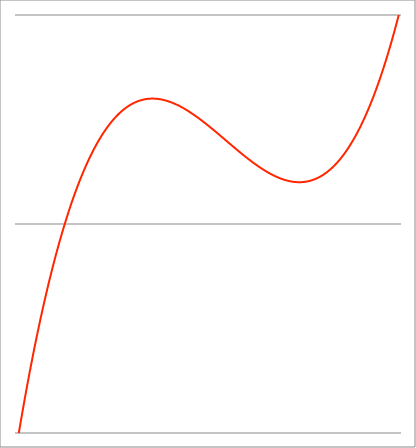
| Category | Series 1 |
|---|---|
| -3.86 | -1.081 |
| -3.85737 | -1.076 |
| -3.85474 | -1.07 |
| -3.85211 | -1.064 |
| -3.84948 | -1.059 |
| -3.84685 | -1.053 |
| -3.84422 | -1.048 |
| -3.84159 | -1.042 |
| -3.838960000000001 | -1.036 |
| -3.836330000000001 | -1.031 |
| -3.833700000000001 | -1.025 |
| -3.831070000000001 | -1.02 |
| -3.828440000000001 | -1.014 |
| -3.825810000000001 | -1.009 |
| -3.823180000000001 | -1.003 |
| -3.820550000000001 | -0.998 |
| -3.817920000000001 | -0.992 |
| -3.815290000000001 | -0.987 |
| -3.812660000000001 | -0.981 |
| -3.810030000000002 | -0.976 |
| -3.807400000000002 | -0.97 |
| -3.804770000000002 | -0.965 |
| -3.802140000000002 | -0.96 |
| -3.799510000000002 | -0.954 |
| -3.796880000000002 | -0.949 |
| -3.794250000000002 | -0.943 |
| -3.791620000000002 | -0.938 |
| -3.788990000000002 | -0.933 |
| -3.786360000000002 | -0.927 |
| -3.783730000000002 | -0.922 |
| -3.781100000000002 | -0.917 |
| -3.778470000000003 | -0.911 |
| -3.775840000000003 | -0.906 |
| -3.773210000000003 | -0.901 |
| -3.770580000000003 | -0.896 |
| -3.767950000000003 | -0.89 |
| -3.765320000000003 | -0.885 |
| -3.762690000000003 | -0.88 |
| -3.760060000000003 | -0.875 |
| -3.757430000000003 | -0.869 |
| -3.754800000000003 | -0.864 |
| -3.752170000000003 | -0.859 |
| -3.749540000000004 | -0.854 |
| -3.746910000000004 | -0.849 |
| -3.744280000000004 | -0.843 |
| -3.741650000000004 | -0.838 |
| -3.739020000000004 | -0.833 |
| -3.736390000000004 | -0.828 |
| -3.733760000000004 | -0.823 |
| -3.731130000000004 | -0.818 |
| -3.728500000000004 | -0.813 |
| -3.725870000000004 | -0.808 |
| -3.723240000000004 | -0.803 |
| -3.720610000000005 | -0.798 |
| -3.717980000000005 | -0.792 |
| -3.715350000000005 | -0.787 |
| -3.712720000000005 | -0.782 |
| -3.710090000000005 | -0.777 |
| -3.707460000000005 | -0.772 |
| -3.704830000000005 | -0.767 |
| -3.702200000000005 | -0.762 |
| -3.699570000000005 | -0.757 |
| -3.696940000000005 | -0.753 |
| -3.694310000000005 | -0.748 |
| -3.691680000000006 | -0.743 |
| -3.689050000000006 | -0.738 |
| -3.686420000000006 | -0.733 |
| -3.683790000000006 | -0.728 |
| -3.681160000000006 | -0.723 |
| -3.678530000000006 | -0.718 |
| -3.675900000000006 | -0.713 |
| -3.673270000000006 | -0.708 |
| -3.670640000000006 | -0.704 |
| -3.668010000000006 | -0.699 |
| -3.665380000000006 | -0.694 |
| -3.662750000000007 | -0.689 |
| -3.660120000000006 | -0.684 |
| -3.657490000000007 | -0.68 |
| -3.654860000000007 | -0.675 |
| -3.652230000000007 | -0.67 |
| -3.649600000000007 | -0.665 |
| -3.646970000000007 | -0.66 |
| -3.644340000000007 | -0.656 |
| -3.641710000000007 | -0.651 |
| -3.639080000000007 | -0.646 |
| -3.636450000000007 | -0.642 |
| -3.633820000000008 | -0.637 |
| -3.631190000000008 | -0.632 |
| -3.628560000000008 | -0.628 |
| -3.625930000000008 | -0.623 |
| -3.623300000000008 | -0.618 |
| -3.620670000000008 | -0.614 |
| -3.618040000000008 | -0.609 |
| -3.615410000000008 | -0.604 |
| -3.612780000000008 | -0.6 |
| -3.610150000000008 | -0.595 |
| -3.607520000000008 | -0.591 |
| -3.604890000000008 | -0.586 |
| -3.602260000000009 | -0.582 |
| -3.599630000000009 | -0.577 |
| -3.597000000000009 | -0.572 |
| -3.594370000000009 | -0.568 |
| -3.591740000000009 | -0.563 |
| -3.58911000000001 | -0.559 |
| -3.586480000000009 | -0.554 |
| -3.583850000000009 | -0.55 |
| -3.581220000000009 | -0.545 |
| -3.578590000000009 | -0.541 |
| -3.57596000000001 | -0.537 |
| -3.57333000000001 | -0.532 |
| -3.57070000000001 | -0.528 |
| -3.56807000000001 | -0.523 |
| -3.56544000000001 | -0.519 |
| -3.56281000000001 | -0.514 |
| -3.56018000000001 | -0.51 |
| -3.55755000000001 | -0.506 |
| -3.55492000000001 | -0.501 |
| -3.55229000000001 | -0.497 |
| -3.54966000000001 | -0.493 |
| -3.54703000000001 | -0.488 |
| -3.544400000000011 | -0.484 |
| -3.541770000000011 | -0.48 |
| -3.539140000000011 | -0.475 |
| -3.536510000000011 | -0.471 |
| -3.533880000000011 | -0.467 |
| -3.531250000000011 | -0.462 |
| -3.528620000000011 | -0.458 |
| -3.525990000000011 | -0.454 |
| -3.523360000000011 | -0.45 |
| -3.520730000000011 | -0.445 |
| -3.518100000000012 | -0.441 |
| -3.515470000000012 | -0.437 |
| -3.512840000000012 | -0.433 |
| -3.510210000000012 | -0.429 |
| -3.507580000000012 | -0.424 |
| -3.504950000000012 | -0.42 |
| -3.502320000000012 | -0.416 |
| -3.499690000000012 | -0.412 |
| -3.497060000000012 | -0.408 |
| -3.494430000000012 | -0.404 |
| -3.491800000000012 | -0.4 |
| -3.489170000000012 | -0.396 |
| -3.486540000000013 | -0.391 |
| -3.483910000000012 | -0.387 |
| -3.481280000000013 | -0.383 |
| -3.478650000000013 | -0.379 |
| -3.476020000000013 | -0.375 |
| -3.473390000000013 | -0.371 |
| -3.470760000000013 | -0.367 |
| -3.468130000000013 | -0.363 |
| -3.465500000000013 | -0.359 |
| -3.462870000000013 | -0.355 |
| -3.460240000000013 | -0.351 |
| -3.457610000000014 | -0.347 |
| -3.454980000000014 | -0.343 |
| -3.452350000000014 | -0.339 |
| -3.449720000000014 | -0.335 |
| -3.447090000000014 | -0.331 |
| -3.444460000000014 | -0.327 |
| -3.441830000000014 | -0.323 |
| -3.439200000000014 | -0.319 |
| -3.436570000000014 | -0.316 |
| -3.433940000000014 | -0.312 |
| -3.431310000000014 | -0.308 |
| -3.428680000000015 | -0.304 |
| -3.426050000000015 | -0.3 |
| -3.423420000000015 | -0.296 |
| -3.420790000000015 | -0.292 |
| -3.418160000000015 | -0.289 |
| -3.415530000000015 | -0.285 |
| -3.412900000000015 | -0.281 |
| -3.410270000000015 | -0.277 |
| -3.407640000000015 | -0.273 |
| -3.405010000000015 | -0.27 |
| -3.402380000000015 | -0.266 |
| -3.399750000000016 | -0.262 |
| -3.397120000000016 | -0.258 |
| -3.394490000000016 | -0.255 |
| -3.391860000000016 | -0.251 |
| -3.389230000000016 | -0.247 |
| -3.386600000000016 | -0.243 |
| -3.383970000000016 | -0.24 |
| -3.381340000000016 | -0.236 |
| -3.378710000000016 | -0.232 |
| -3.376080000000016 | -0.229 |
| -3.373450000000016 | -0.225 |
| -3.370820000000017 | -0.221 |
| -3.368190000000016 | -0.218 |
| -3.365560000000017 | -0.214 |
| -3.362930000000017 | -0.21 |
| -3.360300000000017 | -0.207 |
| -3.357670000000017 | -0.203 |
| -3.355040000000017 | -0.2 |
| -3.352410000000017 | -0.196 |
| -3.349780000000017 | -0.192 |
| -3.347150000000017 | -0.189 |
| -3.344520000000017 | -0.185 |
| -3.341890000000018 | -0.182 |
| -3.339260000000018 | -0.178 |
| -3.336630000000018 | -0.175 |
| -3.334000000000018 | -0.171 |
| -3.331370000000018 | -0.168 |
| -3.328740000000018 | -0.164 |
| -3.326110000000018 | -0.161 |
| -3.323480000000018 | -0.157 |
| -3.320850000000018 | -0.154 |
| -3.318220000000018 | -0.15 |
| -3.315590000000018 | -0.147 |
| -3.312960000000019 | -0.143 |
| -3.310330000000019 | -0.14 |
| -3.307700000000019 | -0.137 |
| -3.305070000000019 | -0.133 |
| -3.302440000000019 | -0.13 |
| -3.299810000000019 | -0.126 |
| -3.29718000000002 | -0.123 |
| -3.29455000000002 | -0.12 |
| -3.29192000000002 | -0.116 |
| -3.28929000000002 | -0.113 |
| -3.286660000000019 | -0.11 |
| -3.28403000000002 | -0.106 |
| -3.28140000000002 | -0.103 |
| -3.27877000000002 | -0.1 |
| -3.27614000000002 | -0.096 |
| -3.27351000000002 | -0.093 |
| -3.27088000000002 | -0.09 |
| -3.26825000000002 | -0.087 |
| -3.26562000000002 | -0.083 |
| -3.26299000000002 | -0.08 |
| -3.26036000000002 | -0.077 |
| -3.25773000000002 | -0.074 |
| -3.255100000000021 | -0.07 |
| -3.252470000000021 | -0.067 |
| -3.249840000000021 | -0.064 |
| -3.247210000000021 | -0.061 |
| -3.244580000000021 | -0.057 |
| -3.241950000000021 | -0.054 |
| -3.239320000000021 | -0.051 |
| -3.236690000000021 | -0.048 |
| -3.234060000000021 | -0.045 |
| -3.231430000000021 | -0.042 |
| -3.228800000000021 | -0.039 |
| -3.226170000000022 | -0.035 |
| -3.223540000000022 | -0.032 |
| -3.220910000000022 | -0.029 |
| -3.218280000000022 | -0.026 |
| -3.215650000000022 | -0.023 |
| -3.213020000000022 | -0.02 |
| -3.210390000000022 | -0.017 |
| -3.207760000000022 | -0.014 |
| -3.205130000000022 | -0.011 |
| -3.202500000000022 | -0.008 |
| -3.199870000000022 | -0.005 |
| -3.197240000000022 | -0.002 |
| -3.194610000000023 | 0.001 |
| -3.191980000000023 | 0.004 |
| -3.189350000000023 | 0.007 |
| -3.186720000000023 | 0.01 |
| -3.184090000000023 | 0.013 |
| -3.181460000000023 | 0.016 |
| -3.178830000000023 | 0.019 |
| -3.176200000000023 | 0.022 |
| -3.173570000000023 | 0.025 |
| -3.170940000000023 | 0.028 |
| -3.168310000000023 | 0.031 |
| -3.165680000000024 | 0.034 |
| -3.163050000000024 | 0.037 |
| -3.160420000000024 | 0.04 |
| -3.157790000000024 | 0.043 |
| -3.155160000000024 | 0.046 |
| -3.152530000000024 | 0.048 |
| -3.149900000000024 | 0.051 |
| -3.147270000000024 | 0.054 |
| -3.144640000000024 | 0.057 |
| -3.142010000000024 | 0.06 |
| -3.139380000000024 | 0.063 |
| -3.136750000000025 | 0.065 |
| -3.134120000000025 | 0.068 |
| -3.131490000000025 | 0.071 |
| -3.128860000000025 | 0.074 |
| -3.126230000000025 | 0.077 |
| -3.123600000000025 | 0.079 |
| -3.120970000000025 | 0.082 |
| -3.118340000000025 | 0.085 |
| -3.115710000000025 | 0.088 |
| -3.113080000000025 | 0.09 |
| -3.110450000000025 | 0.093 |
| -3.107820000000026 | 0.096 |
| -3.105190000000026 | 0.099 |
| -3.102560000000026 | 0.101 |
| -3.099930000000026 | 0.104 |
| -3.097300000000026 | 0.107 |
| -3.094670000000026 | 0.109 |
| -3.092040000000026 | 0.112 |
| -3.089410000000026 | 0.115 |
| -3.086780000000026 | 0.117 |
| -3.084150000000026 | 0.12 |
| -3.081520000000026 | 0.123 |
| -3.078890000000027 | 0.125 |
| -3.076260000000027 | 0.128 |
| -3.073630000000027 | 0.13 |
| -3.071000000000027 | 0.133 |
| -3.068370000000027 | 0.136 |
| -3.065740000000027 | 0.138 |
| -3.063110000000027 | 0.141 |
| -3.060480000000027 | 0.143 |
| -3.057850000000027 | 0.146 |
| -3.055220000000027 | 0.148 |
| -3.052590000000027 | 0.151 |
| -3.049960000000028 | 0.154 |
| -3.047330000000027 | 0.156 |
| -3.044700000000028 | 0.159 |
| -3.042070000000028 | 0.161 |
| -3.039440000000028 | 0.164 |
| -3.036810000000028 | 0.166 |
| -3.034180000000028 | 0.169 |
| -3.031550000000028 | 0.171 |
| -3.028920000000028 | 0.173 |
| -3.026290000000028 | 0.176 |
| -3.023660000000028 | 0.178 |
| -3.021030000000029 | 0.181 |
| -3.018400000000029 | 0.183 |
| -3.015770000000029 | 0.186 |
| -3.013140000000029 | 0.188 |
| -3.010510000000029 | 0.19 |
| -3.007880000000029 | 0.193 |
| -3.005250000000029 | 0.195 |
| -3.002620000000029 | 0.198 |
| -2.999990000000029 | 0.2 |
| -2.997360000000029 | 0.202 |
| -2.994730000000029 | 0.205 |
| -2.992100000000029 | 0.207 |
| -2.98947000000003 | 0.209 |
| -2.98684000000003 | 0.212 |
| -2.98421000000003 | 0.214 |
| -2.98158000000003 | 0.216 |
| -2.97895000000003 | 0.219 |
| -2.97632000000003 | 0.221 |
| -2.97369000000003 | 0.223 |
| -2.97106000000003 | 0.226 |
| -2.96843000000003 | 0.228 |
| -2.96580000000003 | 0.23 |
| -2.96317000000003 | 0.232 |
| -2.960540000000031 | 0.235 |
| -2.957910000000031 | 0.237 |
| -2.955280000000031 | 0.239 |
| -2.952650000000031 | 0.241 |
| -2.950020000000031 | 0.243 |
| -2.947390000000031 | 0.246 |
| -2.944760000000031 | 0.248 |
| -2.942130000000031 | 0.25 |
| -2.939500000000031 | 0.252 |
| -2.936870000000031 | 0.254 |
| -2.934240000000031 | 0.257 |
| -2.931610000000032 | 0.259 |
| -2.928980000000032 | 0.261 |
| -2.926350000000032 | 0.263 |
| -2.923720000000032 | 0.265 |
| -2.921090000000032 | 0.267 |
| -2.918460000000032 | 0.269 |
| -2.915830000000032 | 0.272 |
| -2.913200000000032 | 0.274 |
| -2.910570000000032 | 0.276 |
| -2.907940000000032 | 0.278 |
| -2.905310000000032 | 0.28 |
| -2.902680000000033 | 0.282 |
| -2.900050000000033 | 0.284 |
| -2.897420000000033 | 0.286 |
| -2.894790000000033 | 0.288 |
| -2.892160000000033 | 0.29 |
| -2.889530000000033 | 0.292 |
| -2.886900000000033 | 0.294 |
| -2.884270000000033 | 0.296 |
| -2.881640000000033 | 0.298 |
| -2.879010000000033 | 0.3 |
| -2.876380000000033 | 0.302 |
| -2.873750000000034 | 0.304 |
| -2.871120000000034 | 0.306 |
| -2.868490000000034 | 0.308 |
| -2.865860000000034 | 0.31 |
| -2.863230000000034 | 0.312 |
| -2.860600000000034 | 0.314 |
| -2.857970000000034 | 0.316 |
| -2.855340000000034 | 0.318 |
| -2.852710000000034 | 0.32 |
| -2.850080000000034 | 0.322 |
| -2.847450000000034 | 0.324 |
| -2.844820000000034 | 0.326 |
| -2.842190000000035 | 0.327 |
| -2.839560000000035 | 0.329 |
| -2.836930000000035 | 0.331 |
| -2.834300000000035 | 0.333 |
| -2.831670000000035 | 0.335 |
| -2.829040000000035 | 0.337 |
| -2.826410000000035 | 0.339 |
| -2.823780000000035 | 0.341 |
| -2.821150000000035 | 0.342 |
| -2.818520000000035 | 0.344 |
| -2.815890000000035 | 0.346 |
| -2.813260000000036 | 0.348 |
| -2.810630000000036 | 0.35 |
| -2.808000000000036 | 0.351 |
| -2.805370000000036 | 0.353 |
| -2.802740000000036 | 0.355 |
| -2.800110000000036 | 0.357 |
| -2.797480000000036 | 0.358 |
| -2.794850000000036 | 0.36 |
| -2.792220000000036 | 0.362 |
| -2.789590000000036 | 0.364 |
| -2.786960000000036 | 0.365 |
| -2.784330000000036 | 0.367 |
| -2.781700000000036 | 0.369 |
| -2.779070000000037 | 0.371 |
| -2.776440000000037 | 0.372 |
| -2.773810000000037 | 0.374 |
| -2.771180000000037 | 0.376 |
| -2.768550000000037 | 0.377 |
| -2.765920000000037 | 0.379 |
| -2.763290000000037 | 0.381 |
| -2.760660000000037 | 0.382 |
| -2.758030000000037 | 0.384 |
| -2.755400000000038 | 0.386 |
| -2.752770000000038 | 0.387 |
| -2.750140000000038 | 0.389 |
| -2.747510000000037 | 0.391 |
| -2.744880000000038 | 0.392 |
| -2.742250000000038 | 0.394 |
| -2.739620000000038 | 0.395 |
| -2.736990000000038 | 0.397 |
| -2.734360000000038 | 0.399 |
| -2.731730000000038 | 0.4 |
| -2.729100000000038 | 0.402 |
| -2.726470000000039 | 0.403 |
| -2.723840000000039 | 0.405 |
| -2.721210000000039 | 0.406 |
| -2.718580000000039 | 0.408 |
| -2.715950000000039 | 0.41 |
| -2.713320000000039 | 0.411 |
| -2.71069000000004 | 0.413 |
| -2.70806000000004 | 0.414 |
| -2.70543000000004 | 0.416 |
| -2.702800000000039 | 0.417 |
| -2.70017000000004 | 0.419 |
| -2.697540000000039 | 0.42 |
| -2.69491000000004 | 0.422 |
| -2.69228000000004 | 0.423 |
| -2.68965000000004 | 0.425 |
| -2.68702000000004 | 0.426 |
| -2.68439000000004 | 0.427 |
| -2.68176000000004 | 0.429 |
| -2.67913000000004 | 0.43 |
| -2.67650000000004 | 0.432 |
| -2.67387000000004 | 0.433 |
| -2.67124000000004 | 0.435 |
| -2.66861000000004 | 0.436 |
| -2.665980000000041 | 0.437 |
| -2.663350000000041 | 0.439 |
| -2.660720000000041 | 0.44 |
| -2.658090000000041 | 0.442 |
| -2.655460000000041 | 0.443 |
| -2.652830000000041 | 0.444 |
| -2.650200000000041 | 0.446 |
| -2.647570000000041 | 0.447 |
| -2.644940000000041 | 0.448 |
| -2.642310000000041 | 0.45 |
| -2.639680000000041 | 0.451 |
| -2.637050000000042 | 0.452 |
| -2.634420000000042 | 0.454 |
| -2.631790000000042 | 0.455 |
| -2.629160000000042 | 0.456 |
| -2.626530000000042 | 0.458 |
| -2.623900000000042 | 0.459 |
| -2.621270000000042 | 0.46 |
| -2.618640000000042 | 0.462 |
| -2.616010000000042 | 0.463 |
| -2.613380000000042 | 0.464 |
| -2.610750000000042 | 0.465 |
| -2.608120000000042 | 0.467 |
| -2.605490000000043 | 0.468 |
| -2.602860000000043 | 0.469 |
| -2.600230000000043 | 0.47 |
| -2.597600000000043 | 0.472 |
| -2.594970000000043 | 0.473 |
| -2.592340000000043 | 0.474 |
| -2.589710000000043 | 0.475 |
| -2.587080000000043 | 0.476 |
| -2.584450000000043 | 0.478 |
| -2.581820000000044 | 0.479 |
| -2.579190000000044 | 0.48 |
| -2.576560000000044 | 0.481 |
| -2.573930000000044 | 0.482 |
| -2.571300000000044 | 0.483 |
| -2.568670000000044 | 0.485 |
| -2.566040000000044 | 0.486 |
| -2.563410000000044 | 0.487 |
| -2.560780000000044 | 0.488 |
| -2.558150000000044 | 0.489 |
| -2.555520000000044 | 0.49 |
| -2.552890000000045 | 0.491 |
| -2.550260000000045 | 0.493 |
| -2.547630000000045 | 0.494 |
| -2.545000000000045 | 0.495 |
| -2.542370000000045 | 0.496 |
| -2.539740000000045 | 0.497 |
| -2.537110000000045 | 0.498 |
| -2.534480000000045 | 0.499 |
| -2.531850000000045 | 0.5 |
| -2.529220000000045 | 0.501 |
| -2.526590000000045 | 0.502 |
| -2.523960000000045 | 0.503 |
| -2.521330000000046 | 0.504 |
| -2.518700000000046 | 0.505 |
| -2.516070000000046 | 0.506 |
| -2.513440000000046 | 0.507 |
| -2.510810000000046 | 0.508 |
| -2.508180000000046 | 0.509 |
| -2.505550000000046 | 0.51 |
| -2.502920000000046 | 0.511 |
| -2.500290000000046 | 0.512 |
| -2.497660000000046 | 0.513 |
| -2.495030000000046 | 0.514 |
| -2.492400000000047 | 0.515 |
| -2.489770000000047 | 0.516 |
| -2.487140000000047 | 0.517 |
| -2.484510000000047 | 0.518 |
| -2.481880000000047 | 0.519 |
| -2.479250000000047 | 0.52 |
| -2.476620000000047 | 0.521 |
| -2.473990000000047 | 0.522 |
| -2.471360000000047 | 0.523 |
| -2.468730000000047 | 0.524 |
| -2.466100000000047 | 0.525 |
| -2.463470000000048 | 0.526 |
| -2.460840000000048 | 0.527 |
| -2.458210000000048 | 0.527 |
| -2.455580000000048 | 0.528 |
| -2.452950000000048 | 0.529 |
| -2.450320000000048 | 0.53 |
| -2.447690000000048 | 0.531 |
| -2.445060000000048 | 0.532 |
| -2.442430000000048 | 0.533 |
| -2.439800000000048 | 0.533 |
| -2.437170000000048 | 0.534 |
| -2.434540000000049 | 0.535 |
| -2.431910000000049 | 0.536 |
| -2.429280000000049 | 0.537 |
| -2.426650000000049 | 0.538 |
| -2.424020000000049 | 0.538 |
| -2.421390000000049 | 0.539 |
| -2.418760000000049 | 0.54 |
| -2.416130000000049 | 0.541 |
| -2.413500000000049 | 0.542 |
| -2.410870000000049 | 0.542 |
| -2.408240000000049 | 0.543 |
| -2.40561000000005 | 0.544 |
| -2.40298000000005 | 0.545 |
| -2.40035000000005 | 0.545 |
| -2.39772000000005 | 0.546 |
| -2.39509000000005 | 0.547 |
| -2.39246000000005 | 0.548 |
| -2.38983000000005 | 0.548 |
| -2.38720000000005 | 0.549 |
| -2.38457000000005 | 0.55 |
| -2.38194000000005 | 0.551 |
| -2.37931000000005 | 0.551 |
| -2.37668000000005 | 0.552 |
| -2.374050000000051 | 0.553 |
| -2.371420000000051 | 0.553 |
| -2.368790000000051 | 0.554 |
| -2.366160000000051 | 0.555 |
| -2.363530000000051 | 0.556 |
| -2.360900000000051 | 0.556 |
| -2.358270000000051 | 0.557 |
| -2.355640000000051 | 0.558 |
| -2.353010000000051 | 0.558 |
| -2.350380000000051 | 0.559 |
| -2.347750000000051 | 0.56 |
| -2.345120000000052 | 0.56 |
| -2.342490000000052 | 0.561 |
| -2.339860000000052 | 0.561 |
| -2.337230000000052 | 0.562 |
| -2.334600000000052 | 0.563 |
| -2.331970000000052 | 0.563 |
| -2.329340000000052 | 0.564 |
| -2.326710000000052 | 0.564 |
| -2.324080000000052 | 0.565 |
| -2.321450000000052 | 0.566 |
| -2.318820000000052 | 0.566 |
| -2.316190000000053 | 0.567 |
| -2.313560000000053 | 0.567 |
| -2.310930000000053 | 0.568 |
| -2.308300000000053 | 0.569 |
| -2.305670000000053 | 0.569 |
| -2.303040000000053 | 0.57 |
| -2.300410000000053 | 0.57 |
| -2.297780000000053 | 0.571 |
| -2.295150000000053 | 0.571 |
| -2.292520000000053 | 0.572 |
| -2.289890000000053 | 0.572 |
| -2.287260000000053 | 0.573 |
| -2.284630000000053 | 0.573 |
| -2.282000000000054 | 0.574 |
| -2.279370000000054 | 0.574 |
| -2.276740000000054 | 0.575 |
| -2.274110000000054 | 0.575 |
| -2.271480000000054 | 0.576 |
| -2.268850000000054 | 0.576 |
| -2.266220000000054 | 0.577 |
| -2.263590000000054 | 0.577 |
| -2.260960000000054 | 0.578 |
| -2.258330000000054 | 0.578 |
| -2.255700000000055 | 0.579 |
| -2.253070000000055 | 0.579 |
| -2.250440000000055 | 0.58 |
| -2.247810000000055 | 0.58 |
| -2.245180000000055 | 0.58 |
| -2.242550000000055 | 0.581 |
| -2.239920000000055 | 0.581 |
| -2.237290000000055 | 0.582 |
| -2.234660000000055 | 0.582 |
| -2.232030000000055 | 0.583 |
| -2.229400000000056 | 0.583 |
| -2.226770000000056 | 0.583 |
| -2.224140000000056 | 0.584 |
| -2.221510000000056 | 0.584 |
| -2.218880000000056 | 0.585 |
| -2.216250000000056 | 0.585 |
| -2.213620000000056 | 0.585 |
| -2.210990000000056 | 0.586 |
| -2.208360000000056 | 0.586 |
| -2.205730000000056 | 0.586 |
| -2.203100000000056 | 0.587 |
| -2.200470000000056 | 0.587 |
| -2.197840000000057 | 0.587 |
| -2.195210000000057 | 0.588 |
| -2.192580000000057 | 0.588 |
| -2.189950000000057 | 0.588 |
| -2.187320000000056 | 0.589 |
| -2.184690000000057 | 0.589 |
| -2.182060000000057 | 0.589 |
| -2.179430000000057 | 0.59 |
| -2.176800000000057 | 0.59 |
| -2.174170000000057 | 0.59 |
| -2.171540000000058 | 0.591 |
| -2.168910000000057 | 0.591 |
| -2.166280000000058 | 0.591 |
| -2.163650000000058 | 0.592 |
| -2.161020000000058 | 0.592 |
| -2.158390000000058 | 0.592 |
| -2.155760000000058 | 0.592 |
| -2.153130000000058 | 0.593 |
| -2.150500000000058 | 0.593 |
| -2.147870000000058 | 0.593 |
| -2.145240000000058 | 0.593 |
| -2.142610000000059 | 0.594 |
| -2.139980000000059 | 0.594 |
| -2.137350000000059 | 0.594 |
| -2.134720000000059 | 0.594 |
| -2.132090000000059 | 0.595 |
| -2.129460000000059 | 0.595 |
| -2.12683000000006 | 0.595 |
| -2.12420000000006 | 0.595 |
| -2.12157000000006 | 0.595 |
| -2.118940000000059 | 0.596 |
| -2.116310000000059 | 0.596 |
| -2.11368000000006 | 0.596 |
| -2.11105000000006 | 0.596 |
| -2.10842000000006 | 0.596 |
| -2.10579000000006 | 0.597 |
| -2.10316000000006 | 0.597 |
| -2.10053000000006 | 0.597 |
| -2.09790000000006 | 0.597 |
| -2.09527000000006 | 0.597 |
| -2.09264000000006 | 0.597 |
| -2.09001000000006 | 0.597 |
| -2.08738000000006 | 0.598 |
| -2.08475000000006 | 0.598 |
| -2.082120000000061 | 0.598 |
| -2.079490000000061 | 0.598 |
| -2.076860000000061 | 0.598 |
| -2.074230000000061 | 0.598 |
| -2.071600000000061 | 0.598 |
| -2.068970000000061 | 0.599 |
| -2.066340000000061 | 0.599 |
| -2.063710000000061 | 0.599 |
| -2.061080000000061 | 0.599 |
| -2.058450000000061 | 0.599 |
| -2.055820000000061 | 0.599 |
| -2.053190000000062 | 0.599 |
| -2.050560000000062 | 0.599 |
| -2.047930000000062 | 0.599 |
| -2.045300000000062 | 0.599 |
| -2.042670000000062 | 0.599 |
| -2.040040000000062 | 0.6 |
| -2.037410000000062 | 0.6 |
| -2.034780000000062 | 0.6 |
| -2.032150000000062 | 0.6 |
| -2.029520000000062 | 0.6 |
| -2.026890000000062 | 0.6 |
| -2.024260000000063 | 0.6 |
| -2.021630000000063 | 0.6 |
| -2.019000000000063 | 0.6 |
| -2.016370000000063 | 0.6 |
| -2.013740000000063 | 0.6 |
| -2.011110000000063 | 0.6 |
| -2.008480000000063 | 0.6 |
| -2.005850000000063 | 0.6 |
| -2.003220000000063 | 0.6 |
| -2.000590000000063 | 0.6 |
| -1.997960000000063 | 0.6 |
| -1.995330000000064 | 0.6 |
| -1.992700000000064 | 0.6 |
| -1.990070000000064 | 0.6 |
| -1.987440000000064 | 0.6 |
| -1.984810000000064 | 0.6 |
| -1.982180000000064 | 0.6 |
| -1.979550000000064 | 0.6 |
| -1.976920000000064 | 0.6 |
| -1.974290000000064 | 0.6 |
| -1.971660000000064 | 0.6 |
| -1.969030000000064 | 0.6 |
| -1.966400000000065 | 0.6 |
| -1.963770000000065 | 0.6 |
| -1.961140000000065 | 0.6 |
| -1.958510000000065 | 0.599 |
| -1.955880000000065 | 0.599 |
| -1.953250000000065 | 0.599 |
| -1.950620000000065 | 0.599 |
| -1.947990000000065 | 0.599 |
| -1.945360000000065 | 0.599 |
| -1.942730000000065 | 0.599 |
| -1.940100000000065 | 0.599 |
| -1.937470000000065 | 0.599 |
| -1.934840000000066 | 0.599 |
| -1.932210000000066 | 0.599 |
| -1.929580000000066 | 0.599 |
| -1.926950000000066 | 0.598 |
| -1.924320000000066 | 0.598 |
| -1.921690000000066 | 0.598 |
| -1.919060000000066 | 0.598 |
| -1.916430000000066 | 0.598 |
| -1.913800000000066 | 0.598 |
| -1.911170000000066 | 0.598 |
| -1.908540000000066 | 0.598 |
| -1.905910000000067 | 0.597 |
| -1.903280000000067 | 0.597 |
| -1.900650000000067 | 0.597 |
| -1.898020000000067 | 0.597 |
| -1.895390000000067 | 0.597 |
| -1.892760000000067 | 0.597 |
| -1.890130000000067 | 0.597 |
| -1.887500000000067 | 0.596 |
| -1.884870000000067 | 0.596 |
| -1.882240000000067 | 0.596 |
| -1.879610000000067 | 0.596 |
| -1.876980000000068 | 0.596 |
| -1.874350000000068 | 0.595 |
| -1.871720000000068 | 0.595 |
| -1.869090000000068 | 0.595 |
| -1.866460000000068 | 0.595 |
| -1.863830000000068 | 0.595 |
| -1.861200000000068 | 0.594 |
| -1.858570000000068 | 0.594 |
| -1.855940000000068 | 0.594 |
| -1.853310000000068 | 0.594 |
| -1.850680000000068 | 0.594 |
| -1.848050000000069 | 0.593 |
| -1.845420000000069 | 0.593 |
| -1.842790000000069 | 0.593 |
| -1.840160000000069 | 0.593 |
| -1.837530000000069 | 0.593 |
| -1.834900000000069 | 0.592 |
| -1.83227000000007 | 0.592 |
| -1.829640000000069 | 0.592 |
| -1.827010000000069 | 0.592 |
| -1.824380000000069 | 0.591 |
| -1.821750000000069 | 0.591 |
| -1.81912000000007 | 0.591 |
| -1.81649000000007 | 0.591 |
| -1.81386000000007 | 0.59 |
| -1.81123000000007 | 0.59 |
| -1.80860000000007 | 0.59 |
| -1.80597000000007 | 0.589 |
| -1.80334000000007 | 0.589 |
| -1.80071000000007 | 0.589 |
| -1.79808000000007 | 0.589 |
| -1.79545000000007 | 0.588 |
| -1.79282000000007 | 0.588 |
| -1.79019000000007 | 0.588 |
| -1.787560000000071 | 0.587 |
| -1.784930000000071 | 0.587 |
| -1.782300000000071 | 0.587 |
| -1.779670000000071 | 0.587 |
| -1.777040000000071 | 0.586 |
| -1.774410000000071 | 0.586 |
| -1.771780000000071 | 0.586 |
| -1.769150000000071 | 0.585 |
| -1.766520000000071 | 0.585 |
| -1.763890000000071 | 0.585 |
| -1.761260000000071 | 0.584 |
| -1.758630000000072 | 0.584 |
| -1.756000000000072 | 0.584 |
| -1.753370000000072 | 0.583 |
| -1.750740000000072 | 0.583 |
| -1.748110000000072 | 0.583 |
| -1.745480000000072 | 0.582 |
| -1.742850000000072 | 0.582 |
| -1.740220000000072 | 0.582 |
| -1.737590000000072 | 0.581 |
| -1.734960000000072 | 0.581 |
| -1.732330000000072 | 0.58 |
| -1.729700000000073 | 0.58 |
| -1.727070000000073 | 0.58 |
| -1.724440000000073 | 0.579 |
| -1.721810000000073 | 0.579 |
| -1.719180000000073 | 0.579 |
| -1.716550000000073 | 0.578 |
| -1.713920000000073 | 0.578 |
| -1.711290000000073 | 0.577 |
| -1.708660000000073 | 0.577 |
| -1.706030000000073 | 0.577 |
| -1.703400000000073 | 0.576 |
| -1.700770000000074 | 0.576 |
| -1.698140000000074 | 0.575 |
| -1.695510000000074 | 0.575 |
| -1.692880000000074 | 0.575 |
| -1.690250000000074 | 0.574 |
| -1.687620000000074 | 0.574 |
| -1.684990000000074 | 0.573 |
| -1.682360000000074 | 0.573 |
| -1.679730000000074 | 0.573 |
| -1.677100000000074 | 0.572 |
| -1.674470000000074 | 0.572 |
| -1.671840000000075 | 0.571 |
| -1.669210000000075 | 0.571 |
| -1.666580000000075 | 0.57 |
| -1.663950000000075 | 0.57 |
| -1.661320000000075 | 0.569 |
| -1.658690000000075 | 0.569 |
| -1.656060000000075 | 0.569 |
| -1.653430000000075 | 0.568 |
| -1.650800000000075 | 0.568 |
| -1.648170000000075 | 0.567 |
| -1.645540000000075 | 0.567 |
| -1.642910000000075 | 0.566 |
| -1.640280000000076 | 0.566 |
| -1.637650000000076 | 0.565 |
| -1.635020000000076 | 0.565 |
| -1.632390000000076 | 0.564 |
| -1.629760000000076 | 0.564 |
| -1.627130000000076 | 0.563 |
| -1.624500000000076 | 0.563 |
| -1.621870000000076 | 0.563 |
| -1.619240000000076 | 0.562 |
| -1.616610000000076 | 0.562 |
| -1.613980000000076 | 0.561 |
| -1.611350000000077 | 0.561 |
| -1.608720000000077 | 0.56 |
| -1.606090000000077 | 0.56 |
| -1.603460000000077 | 0.559 |
| -1.600830000000077 | 0.559 |
| -1.598200000000077 | 0.558 |
| -1.595570000000077 | 0.558 |
| -1.592940000000077 | 0.557 |
| -1.590310000000077 | 0.557 |
| -1.587680000000077 | 0.556 |
| -1.585050000000078 | 0.555 |
| -1.582420000000078 | 0.555 |
| -1.579790000000078 | 0.554 |
| -1.577160000000078 | 0.554 |
| -1.574530000000078 | 0.553 |
| -1.571900000000078 | 0.553 |
| -1.569270000000078 | 0.552 |
| -1.566640000000078 | 0.552 |
| -1.564010000000078 | 0.551 |
| -1.561380000000078 | 0.551 |
| -1.558750000000078 | 0.55 |
| -1.556120000000079 | 0.55 |
| -1.553490000000079 | 0.549 |
| -1.550860000000079 | 0.549 |
| -1.548230000000079 | 0.548 |
| -1.545600000000079 | 0.547 |
| -1.542970000000079 | 0.547 |
| -1.54034000000008 | 0.546 |
| -1.537710000000079 | 0.546 |
| -1.535080000000079 | 0.545 |
| -1.532450000000079 | 0.545 |
| -1.529820000000079 | 0.544 |
| -1.52719000000008 | 0.544 |
| -1.52456000000008 | 0.543 |
| -1.52193000000008 | 0.542 |
| -1.51930000000008 | 0.542 |
| -1.51667000000008 | 0.541 |
| -1.51404000000008 | 0.541 |
| -1.51141000000008 | 0.54 |
| -1.50878000000008 | 0.539 |
| -1.50615000000008 | 0.539 |
| -1.50352000000008 | 0.538 |
| -1.50089000000008 | 0.538 |
| -1.49826000000008 | 0.537 |
| -1.495630000000081 | 0.537 |
| -1.493000000000081 | 0.536 |
| -1.490370000000081 | 0.535 |
| -1.487740000000081 | 0.535 |
| -1.485110000000081 | 0.534 |
| -1.482480000000081 | 0.534 |
| -1.479850000000081 | 0.533 |
| -1.477220000000081 | 0.532 |
| -1.474590000000081 | 0.532 |
| -1.471960000000081 | 0.531 |
| -1.469330000000081 | 0.53 |
| -1.466700000000082 | 0.53 |
| -1.464070000000082 | 0.529 |
| -1.461440000000082 | 0.529 |
| -1.458810000000082 | 0.528 |
| -1.456180000000082 | 0.527 |
| -1.453550000000082 | 0.527 |
| -1.450920000000082 | 0.526 |
| -1.448290000000082 | 0.525 |
| -1.445660000000082 | 0.525 |
| -1.443030000000082 | 0.524 |
| -1.440400000000082 | 0.524 |
| -1.437770000000083 | 0.523 |
| -1.435140000000083 | 0.522 |
| -1.432510000000083 | 0.522 |
| -1.429880000000083 | 0.521 |
| -1.427250000000083 | 0.52 |
| -1.424620000000083 | 0.52 |
| -1.421990000000083 | 0.519 |
| -1.419360000000083 | 0.518 |
| -1.416730000000083 | 0.518 |
| -1.414100000000083 | 0.517 |
| -1.411470000000083 | 0.516 |
| -1.408840000000084 | 0.516 |
| -1.406210000000084 | 0.515 |
| -1.403580000000084 | 0.515 |
| -1.400950000000084 | 0.514 |
| -1.398320000000084 | 0.513 |
| -1.395690000000084 | 0.513 |
| -1.393060000000084 | 0.512 |
| -1.390430000000084 | 0.511 |
| -1.387800000000084 | 0.511 |
| -1.385170000000084 | 0.51 |
| -1.382540000000084 | 0.509 |
| -1.379910000000085 | 0.508 |
| -1.377280000000085 | 0.508 |
| -1.374650000000085 | 0.507 |
| -1.372020000000085 | 0.506 |
| -1.369390000000085 | 0.506 |
| -1.366760000000085 | 0.505 |
| -1.364130000000085 | 0.504 |
| -1.361500000000085 | 0.504 |
| -1.358870000000085 | 0.503 |
| -1.356240000000085 | 0.502 |
| -1.353610000000085 | 0.502 |
| -1.350980000000086 | 0.501 |
| -1.348350000000086 | 0.5 |
| -1.345720000000086 | 0.5 |
| -1.343090000000086 | 0.499 |
| -1.340460000000086 | 0.498 |
| -1.337830000000086 | 0.497 |
| -1.335200000000086 | 0.497 |
| -1.332570000000086 | 0.496 |
| -1.329940000000086 | 0.495 |
| -1.327310000000086 | 0.495 |
| -1.324680000000086 | 0.494 |
| -1.322050000000086 | 0.493 |
| -1.319420000000087 | 0.493 |
| -1.316790000000087 | 0.492 |
| -1.314160000000087 | 0.491 |
| -1.311530000000087 | 0.49 |
| -1.308900000000087 | 0.49 |
| -1.306270000000087 | 0.489 |
| -1.303640000000087 | 0.488 |
| -1.301010000000087 | 0.488 |
| -1.298380000000087 | 0.487 |
| -1.295750000000087 | 0.486 |
| -1.293120000000087 | 0.485 |
| -1.290490000000088 | 0.485 |
| -1.287860000000088 | 0.484 |
| -1.285230000000088 | 0.483 |
| -1.282600000000088 | 0.483 |
| -1.279970000000088 | 0.482 |
| -1.277340000000088 | 0.481 |
| -1.274710000000088 | 0.48 |
| -1.272080000000088 | 0.48 |
| -1.269450000000088 | 0.479 |
| -1.266820000000088 | 0.478 |
| -1.264190000000088 | 0.477 |
| -1.261560000000089 | 0.477 |
| -1.258930000000089 | 0.476 |
| -1.256300000000089 | 0.475 |
| -1.253670000000089 | 0.474 |
| -1.251040000000089 | 0.474 |
| -1.24841000000009 | 0.473 |
| -1.245780000000089 | 0.472 |
| -1.243150000000089 | 0.472 |
| -1.240520000000089 | 0.471 |
| -1.237890000000089 | 0.47 |
| -1.235260000000089 | 0.469 |
| -1.23263000000009 | 0.469 |
| -1.23000000000009 | 0.468 |
| -1.22737000000009 | 0.467 |
| -1.22474000000009 | 0.466 |
| -1.22211000000009 | 0.466 |
| -1.21948000000009 | 0.465 |
| -1.21685000000009 | 0.464 |
| -1.21422000000009 | 0.463 |
| -1.21159000000009 | 0.463 |
| -1.20896000000009 | 0.462 |
| -1.20633000000009 | 0.461 |
| -1.203700000000091 | 0.46 |
| -1.201070000000091 | 0.46 |
| -1.198440000000091 | 0.459 |
| -1.195810000000091 | 0.458 |
| -1.193180000000091 | 0.457 |
| -1.190550000000091 | 0.456 |
| -1.187920000000091 | 0.456 |
| -1.185290000000091 | 0.455 |
| -1.182660000000091 | 0.454 |
| -1.180030000000091 | 0.453 |
| -1.177400000000091 | 0.453 |
| -1.174770000000092 | 0.452 |
| -1.172140000000092 | 0.451 |
| -1.169510000000092 | 0.45 |
| -1.166880000000092 | 0.45 |
| -1.164250000000092 | 0.449 |
| -1.161620000000092 | 0.448 |
| -1.158990000000092 | 0.447 |
| -1.156360000000092 | 0.447 |
| -1.153730000000092 | 0.446 |
| -1.151100000000092 | 0.445 |
| -1.148470000000092 | 0.444 |
| -1.145840000000093 | 0.443 |
| -1.143210000000093 | 0.443 |
| -1.140580000000093 | 0.442 |
| -1.137950000000093 | 0.441 |
| -1.135320000000093 | 0.44 |
| -1.132690000000093 | 0.44 |
| -1.130060000000093 | 0.439 |
| -1.127430000000093 | 0.438 |
| -1.124800000000093 | 0.437 |
| -1.122170000000093 | 0.436 |
| -1.119540000000093 | 0.436 |
| -1.116910000000094 | 0.435 |
| -1.114280000000094 | 0.434 |
| -1.111650000000094 | 0.433 |
| -1.109020000000094 | 0.433 |
| -1.106390000000094 | 0.432 |
| -1.103760000000094 | 0.431 |
| -1.101130000000094 | 0.43 |
| -1.098500000000094 | 0.429 |
| -1.095870000000094 | 0.429 |
| -1.093240000000094 | 0.428 |
| -1.090610000000094 | 0.427 |
| -1.087980000000095 | 0.426 |
| -1.085350000000095 | 0.426 |
| -1.082720000000095 | 0.425 |
| -1.080090000000095 | 0.424 |
| -1.077460000000095 | 0.423 |
| -1.074830000000095 | 0.422 |
| -1.072200000000095 | 0.422 |
| -1.069570000000095 | 0.421 |
| -1.066940000000095 | 0.42 |
| -1.064310000000095 | 0.419 |
| -1.061680000000095 | 0.418 |
| -1.059050000000096 | 0.418 |
| -1.056420000000096 | 0.417 |
| -1.053790000000096 | 0.416 |
| -1.051160000000096 | 0.415 |
| -1.048530000000096 | 0.415 |
| -1.045900000000096 | 0.414 |
| -1.043270000000096 | 0.413 |
| -1.040640000000096 | 0.412 |
| -1.038010000000096 | 0.411 |
| -1.035380000000096 | 0.411 |
| -1.032750000000096 | 0.41 |
| -1.030120000000097 | 0.409 |
| -1.027490000000097 | 0.408 |
| -1.024860000000097 | 0.407 |
| -1.022230000000097 | 0.407 |
| -1.019600000000097 | 0.406 |
| -1.016970000000097 | 0.405 |
| -1.014340000000097 | 0.404 |
| -1.011710000000097 | 0.404 |
| -1.009080000000097 | 0.403 |
| -1.006450000000097 | 0.402 |
| -1.003820000000097 | 0.401 |
| -1.001190000000098 | 0.4 |
| -0.998560000000097 | 0.4 |
| -0.995930000000097 | 0.399 |
| -0.993300000000097 | 0.398 |
| -0.990670000000097 | 0.397 |
| -0.988040000000097 | 0.396 |
| -0.985410000000097 | 0.396 |
| -0.982780000000097 | 0.395 |
| -0.980150000000097 | 0.394 |
| -0.977520000000097 | 0.393 |
| -0.974890000000097 | 0.392 |
| -0.972260000000097 | 0.392 |
| -0.969630000000097 | 0.391 |
| -0.967000000000097 | 0.39 |
| -0.964370000000097 | 0.389 |
| -0.961740000000097 | 0.389 |
| -0.959110000000097 | 0.388 |
| -0.956480000000097 | 0.387 |
| -0.953850000000097 | 0.386 |
| -0.951220000000097 | 0.385 |
| -0.948590000000097 | 0.385 |
| -0.945960000000097 | 0.384 |
| -0.943330000000097 | 0.383 |
| -0.940700000000097 | 0.382 |
| -0.938070000000097 | 0.381 |
| -0.935440000000097 | 0.381 |
| -0.932810000000097 | 0.38 |
| -0.930180000000097 | 0.379 |
| -0.927550000000097 | 0.378 |
| -0.924920000000097 | 0.378 |
| -0.922290000000097 | 0.377 |
| -0.919660000000097 | 0.376 |
| -0.917030000000097 | 0.375 |
| -0.914400000000097 | 0.374 |
| -0.911770000000097 | 0.374 |
| -0.909140000000097 | 0.373 |
| -0.906510000000097 | 0.372 |
| -0.903880000000097 | 0.371 |
| -0.901250000000097 | 0.37 |
| -0.898620000000097 | 0.37 |
| -0.895990000000097 | 0.369 |
| -0.893360000000097 | 0.368 |
| -0.890730000000097 | 0.367 |
| -0.888100000000097 | 0.367 |
| -0.885470000000097 | 0.366 |
| -0.882840000000096 | 0.365 |
| -0.880210000000096 | 0.364 |
| -0.877580000000096 | 0.363 |
| -0.874950000000096 | 0.363 |
| -0.872320000000096 | 0.362 |
| -0.869690000000096 | 0.361 |
| -0.867060000000096 | 0.36 |
| -0.864430000000096 | 0.36 |
| -0.861800000000096 | 0.359 |
| -0.859170000000096 | 0.358 |
| -0.856540000000096 | 0.357 |
| -0.853910000000096 | 0.356 |
| -0.851280000000096 | 0.356 |
| -0.848650000000096 | 0.355 |
| -0.846020000000096 | 0.354 |
| -0.843390000000096 | 0.353 |
| -0.840760000000096 | 0.353 |
| -0.838130000000096 | 0.352 |
| -0.835500000000096 | 0.351 |
| -0.832870000000096 | 0.35 |
| -0.830240000000096 | 0.35 |
| -0.827610000000096 | 0.349 |
| -0.824980000000096 | 0.348 |
| -0.822350000000096 | 0.347 |
| -0.819720000000096 | 0.347 |
| -0.817090000000096 | 0.346 |
| -0.814460000000096 | 0.345 |
| -0.811830000000096 | 0.344 |
| -0.809200000000096 | 0.343 |
| -0.806570000000096 | 0.343 |
| -0.803940000000096 | 0.342 |
| -0.801310000000096 | 0.341 |
| -0.798680000000096 | 0.34 |
| -0.796050000000096 | 0.34 |
| -0.793420000000096 | 0.339 |
| -0.790790000000096 | 0.338 |
| -0.788160000000096 | 0.337 |
| -0.785530000000096 | 0.337 |
| -0.782900000000096 | 0.336 |
| -0.780270000000096 | 0.335 |
| -0.777640000000096 | 0.334 |
| -0.775010000000096 | 0.334 |
| -0.772380000000096 | 0.333 |
| -0.769750000000096 | 0.332 |
| -0.767120000000096 | 0.331 |
| -0.764490000000096 | 0.331 |
| -0.761860000000095 | 0.33 |
| -0.759230000000095 | 0.329 |
| -0.756600000000095 | 0.328 |
| -0.753970000000095 | 0.328 |
| -0.751340000000095 | 0.327 |
| -0.748710000000095 | 0.326 |
| -0.746080000000095 | 0.325 |
| -0.743450000000095 | 0.325 |
| -0.740820000000095 | 0.324 |
| -0.738190000000095 | 0.323 |
| -0.735560000000095 | 0.323 |
| -0.732930000000095 | 0.322 |
| -0.730300000000095 | 0.321 |
| -0.727670000000095 | 0.32 |
| -0.725040000000095 | 0.32 |
| -0.722410000000095 | 0.319 |
| -0.719780000000095 | 0.318 |
| -0.717150000000095 | 0.317 |
| -0.714520000000095 | 0.317 |
| -0.711890000000095 | 0.316 |
| -0.709260000000095 | 0.315 |
| -0.706630000000095 | 0.315 |
| -0.704000000000095 | 0.314 |
| -0.701370000000095 | 0.313 |
| -0.698740000000095 | 0.312 |
| -0.696110000000095 | 0.312 |
| -0.693480000000095 | 0.311 |
| -0.690850000000095 | 0.31 |
| -0.688220000000095 | 0.309 |
| -0.685590000000095 | 0.309 |
| -0.682960000000095 | 0.308 |
| -0.680330000000095 | 0.307 |
| -0.677700000000095 | 0.307 |
| -0.675070000000095 | 0.306 |
| -0.672440000000095 | 0.305 |
| -0.669810000000095 | 0.305 |
| -0.667180000000095 | 0.304 |
| -0.664550000000095 | 0.303 |
| -0.661920000000095 | 0.302 |
| -0.659290000000095 | 0.302 |
| -0.656660000000095 | 0.301 |
| -0.654030000000095 | 0.3 |
| -0.651400000000095 | 0.3 |
| -0.648770000000095 | 0.299 |
| -0.646140000000095 | 0.298 |
| -0.643510000000095 | 0.298 |
| -0.640880000000094 | 0.297 |
| -0.638250000000094 | 0.296 |
| -0.635620000000094 | 0.296 |
| -0.632990000000094 | 0.295 |
| -0.630360000000094 | 0.294 |
| -0.627730000000094 | 0.293 |
| -0.625100000000094 | 0.293 |
| -0.622470000000094 | 0.292 |
| -0.619840000000094 | 0.291 |
| -0.617210000000094 | 0.291 |
| -0.614580000000094 | 0.29 |
| -0.611950000000094 | 0.289 |
| -0.609320000000094 | 0.289 |
| -0.606690000000094 | 0.288 |
| -0.604060000000094 | 0.287 |
| -0.601430000000094 | 0.287 |
| -0.598800000000094 | 0.286 |
| -0.596170000000094 | 0.285 |
| -0.593540000000094 | 0.285 |
| -0.590910000000094 | 0.284 |
| -0.588280000000094 | 0.283 |
| -0.585650000000094 | 0.283 |
| -0.583020000000094 | 0.282 |
| -0.580390000000094 | 0.282 |
| -0.577760000000094 | 0.281 |
| -0.575130000000094 | 0.28 |
| -0.572500000000094 | 0.28 |
| -0.569870000000094 | 0.279 |
| -0.567240000000094 | 0.278 |
| -0.564610000000094 | 0.278 |
| -0.561980000000094 | 0.277 |
| -0.559350000000094 | 0.276 |
| -0.556720000000094 | 0.276 |
| -0.554090000000094 | 0.275 |
| -0.551460000000094 | 0.274 |
| -0.548830000000094 | 0.274 |
| -0.546200000000094 | 0.273 |
| -0.543570000000094 | 0.273 |
| -0.540940000000094 | 0.272 |
| -0.538310000000094 | 0.271 |
| -0.535680000000094 | 0.271 |
| -0.533050000000094 | 0.27 |
| -0.530420000000094 | 0.269 |
| -0.527790000000094 | 0.269 |
| -0.525160000000094 | 0.268 |
| -0.522530000000094 | 0.268 |
| -0.519900000000094 | 0.267 |
| -0.517270000000094 | 0.266 |
| -0.514640000000094 | 0.266 |
| -0.512010000000094 | 0.265 |
| -0.509380000000094 | 0.265 |
| -0.506750000000094 | 0.264 |
| -0.504120000000093 | 0.263 |
| -0.501490000000093 | 0.263 |
| -0.498860000000093 | 0.262 |
| -0.496230000000093 | 0.262 |
| -0.493600000000093 | 0.261 |
| -0.490970000000093 | 0.26 |
| -0.488340000000093 | 0.26 |
| -0.485710000000093 | 0.259 |
| -0.483080000000093 | 0.259 |
| -0.480450000000093 | 0.258 |
| -0.477820000000093 | 0.258 |
| -0.475190000000093 | 0.257 |
| -0.472560000000093 | 0.256 |
| -0.469930000000093 | 0.256 |
| -0.467300000000093 | 0.255 |
| -0.464670000000093 | 0.255 |
| -0.462040000000093 | 0.254 |
| -0.459410000000093 | 0.254 |
| -0.456780000000093 | 0.253 |
| -0.454150000000093 | 0.253 |
| -0.451520000000093 | 0.252 |
| -0.448890000000093 | 0.251 |
| -0.446260000000093 | 0.251 |
| -0.443630000000093 | 0.25 |
| -0.441000000000093 | 0.25 |
| -0.438370000000093 | 0.249 |
| -0.435740000000093 | 0.249 |
| -0.433110000000093 | 0.248 |
| -0.430480000000093 | 0.248 |
| -0.427850000000093 | 0.247 |
| -0.425220000000093 | 0.247 |
| -0.422590000000093 | 0.246 |
| -0.419960000000093 | 0.246 |
| -0.417330000000093 | 0.245 |
| -0.414700000000093 | 0.244 |
| -0.412070000000093 | 0.244 |
| -0.409440000000093 | 0.243 |
| -0.406810000000093 | 0.243 |
| -0.404180000000093 | 0.242 |
| -0.401550000000093 | 0.242 |
| -0.398920000000093 | 0.241 |
| -0.396290000000093 | 0.241 |
| -0.393660000000093 | 0.24 |
| -0.391030000000093 | 0.24 |
| -0.388400000000092 | 0.239 |
| -0.385770000000092 | 0.239 |
| -0.383140000000092 | 0.238 |
| -0.380510000000092 | 0.238 |
| -0.377880000000092 | 0.237 |
| -0.375250000000092 | 0.237 |
| -0.372620000000092 | 0.236 |
| -0.369990000000092 | 0.236 |
| -0.367360000000092 | 0.236 |
| -0.364730000000092 | 0.235 |
| -0.362100000000092 | 0.235 |
| -0.359470000000092 | 0.234 |
| -0.356840000000092 | 0.234 |
| -0.354210000000092 | 0.233 |
| -0.351580000000092 | 0.233 |
| -0.348950000000092 | 0.232 |
| -0.346320000000092 | 0.232 |
| -0.343690000000092 | 0.231 |
| -0.341060000000092 | 0.231 |
| -0.338430000000092 | 0.23 |
| -0.335800000000092 | 0.23 |
| -0.333170000000092 | 0.23 |
| -0.330540000000092 | 0.229 |
| -0.327910000000092 | 0.229 |
| -0.325280000000092 | 0.228 |
| -0.322650000000092 | 0.228 |
| -0.320020000000092 | 0.227 |
| -0.317390000000092 | 0.227 |
| -0.314760000000092 | 0.227 |
| -0.312130000000092 | 0.226 |
| -0.309500000000092 | 0.226 |
| -0.306870000000092 | 0.225 |
| -0.304240000000092 | 0.225 |
| -0.301610000000092 | 0.225 |
| -0.298980000000092 | 0.224 |
| -0.296350000000092 | 0.224 |
| -0.293720000000092 | 0.223 |
| -0.291090000000092 | 0.223 |
| -0.288460000000092 | 0.223 |
| -0.285830000000092 | 0.222 |
| -0.283200000000092 | 0.222 |
| -0.280570000000092 | 0.221 |
| -0.277940000000092 | 0.221 |
| -0.275310000000092 | 0.221 |
| -0.272680000000092 | 0.22 |
| -0.270050000000092 | 0.22 |
| -0.267420000000092 | 0.22 |
| -0.264790000000092 | 0.219 |
| -0.262160000000092 | 0.219 |
| -0.259530000000091 | 0.218 |
| -0.256900000000091 | 0.218 |
| -0.254270000000091 | 0.218 |
| -0.251640000000091 | 0.217 |
| -0.249010000000091 | 0.217 |
| -0.246380000000091 | 0.217 |
| -0.243750000000091 | 0.216 |
| -0.241120000000091 | 0.216 |
| -0.238490000000091 | 0.216 |
| -0.235860000000091 | 0.215 |
| -0.233230000000091 | 0.215 |
| -0.230600000000091 | 0.215 |
| -0.227970000000091 | 0.214 |
| -0.225340000000092 | 0.214 |
| -0.222710000000092 | 0.214 |
| -0.220080000000092 | 0.213 |
| -0.217450000000092 | 0.213 |
| -0.214820000000092 | 0.213 |
| -0.212190000000092 | 0.213 |
| -0.209560000000092 | 0.212 |
| -0.206930000000092 | 0.212 |
| -0.204300000000092 | 0.212 |
| -0.201670000000092 | 0.211 |
| -0.199040000000092 | 0.211 |
| -0.196410000000092 | 0.211 |
| -0.193780000000092 | 0.211 |
| -0.191150000000092 | 0.21 |
| -0.188520000000092 | 0.21 |
| -0.185890000000092 | 0.21 |
| -0.183260000000092 | 0.209 |
| -0.180630000000092 | 0.209 |
| -0.178000000000092 | 0.209 |
| -0.175370000000092 | 0.209 |
| -0.172740000000092 | 0.208 |
| -0.170110000000092 | 0.208 |
| -0.167480000000092 | 0.208 |
| -0.164850000000092 | 0.208 |
| -0.162220000000092 | 0.207 |
| -0.159590000000092 | 0.207 |
| -0.156960000000092 | 0.207 |
| -0.154330000000092 | 0.207 |
| -0.151700000000092 | 0.207 |
| -0.149070000000092 | 0.206 |
| -0.146440000000092 | 0.206 |
| -0.143810000000092 | 0.206 |
| -0.141180000000092 | 0.206 |
| -0.138550000000092 | 0.205 |
| -0.135920000000092 | 0.205 |
| -0.133290000000092 | 0.205 |
| -0.130660000000092 | 0.205 |
| -0.128030000000092 | 0.205 |
| -0.125400000000092 | 0.205 |
| -0.122770000000092 | 0.204 |
| -0.120140000000092 | 0.204 |
| -0.117510000000092 | 0.204 |
| -0.114880000000092 | 0.204 |
| -0.112250000000092 | 0.204 |
| -0.109620000000092 | 0.203 |
| -0.106990000000092 | 0.203 |
| -0.104360000000092 | 0.203 |
| -0.101730000000092 | 0.203 |
| -0.0991000000000918 | 0.203 |
| -0.0964700000000918 | 0.203 |
| -0.0938400000000918 | 0.203 |
| -0.0912100000000918 | 0.202 |
| -0.0885800000000918 | 0.202 |
| -0.0859500000000919 | 0.202 |
| -0.0833200000000919 | 0.202 |
| -0.0806900000000919 | 0.202 |
| -0.0780600000000919 | 0.202 |
| -0.0754300000000919 | 0.202 |
| -0.0728000000000919 | 0.202 |
| -0.0701700000000919 | 0.201 |
| -0.0675400000000919 | 0.201 |
| -0.0649100000000919 | 0.201 |
| -0.0622800000000919 | 0.201 |
| -0.0596500000000919 | 0.201 |
| -0.0570200000000919 | 0.201 |
| -0.0543900000000919 | 0.201 |
| -0.0517600000000919 | 0.201 |
| -0.0491300000000919 | 0.201 |
| -0.0465000000000919 | 0.201 |
| -0.0438700000000919 | 0.201 |
| -0.0412400000000919 | 0.201 |
| -0.0386100000000919 | 0.2 |
| -0.0359800000000919 | 0.2 |
| -0.0333500000000919 | 0.2 |
| -0.0307200000000919 | 0.2 |
| -0.0280900000000919 | 0.2 |
| -0.0254600000000919 | 0.2 |
| -0.0228300000000919 | 0.2 |
| -0.0202000000000919 | 0.2 |
| -0.0175700000000919 | 0.2 |
| -0.0149400000000919 | 0.2 |
| -0.0123100000000919 | 0.2 |
| -0.00968000000009191 | 0.2 |
| -0.00705000000009191 | 0.2 |
| -0.00442000000009191 | 0.2 |
| -0.00179000000009191 | 0.2 |
| 0.000839999999908087 | 0.2 |
| 0.00346999999990809 | 0.2 |
| 0.00609999999990809 | 0.2 |
| 0.00872999999990809 | 0.2 |
| 0.0113599999999081 | 0.2 |
| 0.0139899999999081 | 0.2 |
| 0.0166199999999081 | 0.2 |
| 0.0192499999999081 | 0.2 |
| 0.0218799999999081 | 0.2 |
| 0.0245099999999081 | 0.2 |
| 0.0271399999999081 | 0.2 |
| 0.0297699999999081 | 0.2 |
| 0.0323999999999081 | 0.2 |
| 0.0350299999999081 | 0.2 |
| 0.0376599999999081 | 0.2 |
| 0.0402899999999081 | 0.2 |
| 0.0429199999999081 | 0.201 |
| 0.0455499999999081 | 0.201 |
| 0.0481799999999081 | 0.201 |
| 0.0508099999999081 | 0.201 |
| 0.0534399999999081 | 0.201 |
| 0.0560699999999081 | 0.201 |
| 0.0586999999999081 | 0.201 |
| 0.0613299999999081 | 0.201 |
| 0.0639599999999081 | 0.201 |
| 0.0665899999999081 | 0.201 |
| 0.0692199999999081 | 0.201 |
| 0.0718499999999081 | 0.202 |
| 0.0744799999999081 | 0.202 |
| 0.077109999999908 | 0.202 |
| 0.079739999999908 | 0.202 |
| 0.082369999999908 | 0.202 |
| 0.084999999999908 | 0.202 |
| 0.087629999999908 | 0.202 |
| 0.090259999999908 | 0.203 |
| 0.092889999999908 | 0.203 |
| 0.095519999999908 | 0.203 |
| 0.098149999999908 | 0.203 |
| 0.100779999999908 | 0.203 |
| 0.103409999999908 | 0.203 |
| 0.106039999999908 | 0.203 |
| 0.108669999999908 | 0.204 |
| 0.111299999999908 | 0.204 |
| 0.113929999999908 | 0.204 |
| 0.116559999999908 | 0.204 |
| 0.119189999999908 | 0.204 |
| 0.121819999999908 | 0.205 |
| 0.124449999999908 | 0.205 |
| 0.127079999999908 | 0.205 |
| 0.129709999999908 | 0.205 |
| 0.132339999999908 | 0.205 |
| 0.134969999999908 | 0.206 |
| 0.137599999999908 | 0.206 |
| 0.140229999999908 | 0.206 |
| 0.142859999999908 | 0.206 |
| 0.145489999999908 | 0.207 |
| 0.148119999999908 | 0.207 |
| 0.150749999999908 | 0.207 |
| 0.153379999999908 | 0.207 |
| 0.156009999999908 | 0.208 |
| 0.158639999999908 | 0.208 |
| 0.161269999999908 | 0.208 |
| 0.163899999999908 | 0.208 |
| 0.166529999999908 | 0.209 |
| 0.169159999999908 | 0.209 |
| 0.171789999999908 | 0.209 |
| 0.174419999999908 | 0.21 |
| 0.177049999999908 | 0.21 |
| 0.179679999999908 | 0.21 |
| 0.182309999999908 | 0.211 |
| 0.184939999999908 | 0.211 |
| 0.187569999999908 | 0.211 |
| 0.190199999999908 | 0.212 |
| 0.192829999999908 | 0.212 |
| 0.195459999999908 | 0.212 |
| 0.198089999999908 | 0.213 |
| 0.200719999999908 | 0.213 |
| 0.203349999999908 | 0.213 |
| 0.205979999999908 | 0.214 |
| 0.208609999999908 | 0.214 |
| 0.211239999999908 | 0.214 |
| 0.213869999999908 | 0.215 |
| 0.216499999999908 | 0.215 |
| 0.219129999999908 | 0.215 |
| 0.221759999999908 | 0.216 |
| 0.224389999999908 | 0.216 |
| 0.227019999999908 | 0.217 |
| 0.229649999999908 | 0.217 |
| 0.232279999999908 | 0.217 |
| 0.234909999999908 | 0.218 |
| 0.237539999999908 | 0.218 |
| 0.240169999999908 | 0.219 |
| 0.242799999999908 | 0.219 |
| 0.245429999999908 | 0.22 |
| 0.248059999999908 | 0.22 |
| 0.250689999999908 | 0.22 |
| 0.253319999999908 | 0.221 |
| 0.255949999999908 | 0.221 |
| 0.258579999999908 | 0.222 |
| 0.261209999999908 | 0.222 |
| 0.263839999999908 | 0.223 |
| 0.266469999999908 | 0.223 |
| 0.269099999999908 | 0.224 |
| 0.271729999999908 | 0.224 |
| 0.274359999999908 | 0.225 |
| 0.276989999999908 | 0.225 |
| 0.279619999999908 | 0.226 |
| 0.282249999999908 | 0.226 |
| 0.284879999999908 | 0.227 |
| 0.287509999999908 | 0.227 |
| 0.290139999999908 | 0.228 |
| 0.292769999999908 | 0.228 |
| 0.295399999999908 | 0.229 |
| 0.298029999999908 | 0.229 |
| 0.300659999999908 | 0.23 |
| 0.303289999999908 | 0.23 |
| 0.305919999999908 | 0.231 |
| 0.308549999999908 | 0.231 |
| 0.311179999999908 | 0.232 |
| 0.313809999999908 | 0.233 |
| 0.316439999999908 | 0.233 |
| 0.319069999999908 | 0.234 |
| 0.321699999999908 | 0.234 |
| 0.324329999999908 | 0.235 |
| 0.326959999999908 | 0.236 |
| 0.329589999999908 | 0.236 |
| 0.332219999999908 | 0.237 |
| 0.334849999999908 | 0.237 |
| 0.337479999999908 | 0.238 |
| 0.340109999999908 | 0.239 |
| 0.342739999999908 | 0.239 |
| 0.345369999999908 | 0.24 |
| 0.347999999999908 | 0.241 |
| 0.350629999999908 | 0.241 |
| 0.353259999999908 | 0.242 |
| 0.355889999999908 | 0.243 |
| 0.358519999999908 | 0.243 |
| 0.361149999999908 | 0.244 |
| 0.363779999999909 | 0.245 |
| 0.366409999999909 | 0.245 |
| 0.369039999999909 | 0.246 |
| 0.371669999999909 | 0.247 |
| 0.374299999999909 | 0.247 |
| 0.376929999999909 | 0.248 |
| 0.379559999999909 | 0.249 |
| 0.382189999999909 | 0.249 |
| 0.384819999999909 | 0.25 |
| 0.387449999999909 | 0.251 |
| 0.390079999999909 | 0.252 |
| 0.392709999999909 | 0.252 |
| 0.395339999999909 | 0.253 |
| 0.397969999999909 | 0.254 |
| 0.400599999999909 | 0.255 |
| 0.403229999999909 | 0.255 |
| 0.405859999999909 | 0.256 |
| 0.408489999999909 | 0.257 |
| 0.411119999999909 | 0.258 |
| 0.413749999999909 | 0.258 |
| 0.416379999999909 | 0.259 |
| 0.419009999999909 | 0.26 |
| 0.421639999999909 | 0.261 |
| 0.424269999999909 | 0.262 |
| 0.426899999999909 | 0.262 |
| 0.429529999999909 | 0.263 |
| 0.432159999999909 | 0.264 |
| 0.434789999999909 | 0.265 |
| 0.437419999999909 | 0.266 |
| 0.440049999999909 | 0.267 |
| 0.442679999999909 | 0.267 |
| 0.445309999999909 | 0.268 |
| 0.447939999999909 | 0.269 |
| 0.450569999999909 | 0.27 |
| 0.453199999999909 | 0.271 |
| 0.455829999999909 | 0.272 |
| 0.458459999999909 | 0.273 |
| 0.461089999999909 | 0.274 |
| 0.463719999999909 | 0.274 |
| 0.466349999999909 | 0.275 |
| 0.468979999999909 | 0.276 |
| 0.471609999999909 | 0.277 |
| 0.474239999999909 | 0.278 |
| 0.476869999999909 | 0.279 |
| 0.479499999999909 | 0.28 |
| 0.482129999999909 | 0.281 |
| 0.48475999999991 | 0.282 |
| 0.48738999999991 | 0.283 |
| 0.49001999999991 | 0.284 |
| 0.49264999999991 | 0.285 |
| 0.49527999999991 | 0.286 |
| 0.49790999999991 | 0.287 |
| 0.50053999999991 | 0.288 |
| 0.50316999999991 | 0.289 |
| 0.50579999999991 | 0.29 |
| 0.50842999999991 | 0.291 |
| 0.51105999999991 | 0.292 |
| 0.51368999999991 | 0.293 |
| 0.51631999999991 | 0.294 |
| 0.51894999999991 | 0.295 |
| 0.52157999999991 | 0.296 |
| 0.52420999999991 | 0.297 |
| 0.52683999999991 | 0.298 |
| 0.52946999999991 | 0.299 |
| 0.53209999999991 | 0.3 |
| 0.53472999999991 | 0.301 |
| 0.53735999999991 | 0.302 |
| 0.53998999999991 | 0.303 |
| 0.54261999999991 | 0.304 |
| 0.54524999999991 | 0.305 |
| 0.54787999999991 | 0.306 |
| 0.55050999999991 | 0.308 |
| 0.55313999999991 | 0.309 |
| 0.55576999999991 | 0.31 |
| 0.55839999999991 | 0.311 |
| 0.56102999999991 | 0.312 |
| 0.56365999999991 | 0.313 |
| 0.56628999999991 | 0.314 |
| 0.56891999999991 | 0.316 |
| 0.57154999999991 | 0.317 |
| 0.57417999999991 | 0.318 |
| 0.57680999999991 | 0.319 |
| 0.57943999999991 | 0.32 |
| 0.58206999999991 | 0.321 |
| 0.58469999999991 | 0.323 |
| 0.58732999999991 | 0.324 |
| 0.58995999999991 | 0.325 |
| 0.59258999999991 | 0.326 |
| 0.59521999999991 | 0.327 |
| 0.59784999999991 | 0.329 |
| 0.60047999999991 | 0.33 |
| 0.60310999999991 | 0.331 |
| 0.60573999999991 | 0.332 |
| 0.60836999999991 | 0.334 |
| 0.61099999999991 | 0.335 |
| 0.61362999999991 | 0.336 |
| 0.61625999999991 | 0.337 |
| 0.61888999999991 | 0.339 |
| 0.62151999999991 | 0.34 |
| 0.624149999999911 | 0.341 |
| 0.626779999999911 | 0.342 |
| 0.629409999999911 | 0.344 |
| 0.632039999999911 | 0.345 |
| 0.634669999999911 | 0.346 |
| 0.637299999999911 | 0.348 |
| 0.639929999999911 | 0.349 |
| 0.642559999999911 | 0.35 |
| 0.645189999999911 | 0.352 |
| 0.647819999999911 | 0.353 |
| 0.650449999999911 | 0.354 |
| 0.653079999999911 | 0.356 |
| 0.655709999999911 | 0.357 |
| 0.658339999999911 | 0.359 |
| 0.660969999999911 | 0.36 |
| 0.663599999999911 | 0.361 |
| 0.666229999999911 | 0.363 |
| 0.668859999999911 | 0.364 |
| 0.671489999999911 | 0.366 |
| 0.674119999999911 | 0.367 |
| 0.676749999999911 | 0.368 |
| 0.679379999999911 | 0.37 |
| 0.682009999999911 | 0.371 |
| 0.684639999999911 | 0.373 |
| 0.687269999999911 | 0.374 |
| 0.689899999999911 | 0.376 |
| 0.692529999999911 | 0.377 |
| 0.695159999999911 | 0.379 |
| 0.697789999999911 | 0.38 |
| 0.700419999999911 | 0.382 |
| 0.703049999999911 | 0.383 |
| 0.705679999999911 | 0.385 |
| 0.708309999999911 | 0.386 |
| 0.710939999999911 | 0.388 |
| 0.713569999999911 | 0.389 |
| 0.716199999999911 | 0.391 |
| 0.718829999999911 | 0.392 |
| 0.721459999999911 | 0.394 |
| 0.724089999999911 | 0.395 |
| 0.726719999999911 | 0.397 |
| 0.729349999999911 | 0.398 |
| 0.731979999999911 | 0.4 |
| 0.734609999999911 | 0.402 |
| 0.737239999999911 | 0.403 |
| 0.739869999999911 | 0.405 |
| 0.742499999999911 | 0.406 |
| 0.745129999999912 | 0.408 |
| 0.747759999999912 | 0.41 |
| 0.750389999999912 | 0.411 |
| 0.753019999999912 | 0.413 |
| 0.755649999999912 | 0.414 |
| 0.758279999999912 | 0.416 |
| 0.760909999999912 | 0.418 |
| 0.763539999999912 | 0.419 |
| 0.766169999999912 | 0.421 |
| 0.768799999999912 | 0.423 |
| 0.771429999999912 | 0.424 |
| 0.774059999999912 | 0.426 |
| 0.776689999999912 | 0.428 |
| 0.779319999999912 | 0.43 |
| 0.781949999999912 | 0.431 |
| 0.784579999999912 | 0.433 |
| 0.787209999999912 | 0.435 |
| 0.789839999999912 | 0.436 |
| 0.792469999999912 | 0.438 |
| 0.795099999999912 | 0.44 |
| 0.797729999999912 | 0.442 |
| 0.800359999999912 | 0.443 |
| 0.802989999999912 | 0.445 |
| 0.805619999999912 | 0.447 |
| 0.808249999999912 | 0.449 |
| 0.810879999999912 | 0.451 |
| 0.813509999999912 | 0.452 |
| 0.816139999999912 | 0.454 |
| 0.818769999999912 | 0.456 |
| 0.821399999999912 | 0.458 |
| 0.824029999999912 | 0.46 |
| 0.826659999999912 | 0.462 |
| 0.829289999999912 | 0.463 |
| 0.831919999999912 | 0.465 |
| 0.834549999999912 | 0.467 |
| 0.837179999999912 | 0.469 |
| 0.839809999999912 | 0.471 |
| 0.842439999999912 | 0.473 |
| 0.845069999999912 | 0.475 |
| 0.847699999999912 | 0.476 |
| 0.850329999999912 | 0.478 |
| 0.852959999999912 | 0.48 |
| 0.855589999999912 | 0.482 |
| 0.858219999999912 | 0.484 |
| 0.860849999999912 | 0.486 |
| 0.863479999999912 | 0.488 |
| 0.866109999999913 | 0.49 |
| 0.868739999999913 | 0.492 |
| 0.871369999999913 | 0.494 |
| 0.873999999999913 | 0.496 |
| 0.876629999999913 | 0.498 |
| 0.879259999999913 | 0.5 |
| 0.881889999999913 | 0.502 |
| 0.884519999999913 | 0.504 |
| 0.887149999999913 | 0.506 |
| 0.889779999999913 | 0.508 |
| 0.892409999999913 | 0.51 |
| 0.895039999999913 | 0.512 |
| 0.897669999999913 | 0.514 |
| 0.900299999999913 | 0.516 |
| 0.902929999999913 | 0.518 |
| 0.905559999999913 | 0.52 |
| 0.908189999999913 | 0.522 |
| 0.910819999999913 | 0.524 |
| 0.913449999999913 | 0.527 |
| 0.916079999999913 | 0.529 |
| 0.918709999999913 | 0.531 |
| 0.921339999999913 | 0.533 |
| 0.923969999999913 | 0.535 |
| 0.926599999999913 | 0.537 |
| 0.929229999999913 | 0.539 |
| 0.931859999999913 | 0.541 |
| 0.934489999999913 | 0.544 |
| 0.937119999999913 | 0.546 |
| 0.939749999999913 | 0.548 |
| 0.942379999999913 | 0.55 |
| 0.945009999999913 | 0.552 |
| 0.947639999999913 | 0.555 |
| 0.950269999999913 | 0.557 |
| 0.952899999999913 | 0.559 |
| 0.955529999999913 | 0.561 |
| 0.958159999999913 | 0.563 |
| 0.960789999999913 | 0.566 |
| 0.963419999999913 | 0.568 |
| 0.966049999999913 | 0.57 |
| 0.968679999999913 | 0.572 |
| 0.971309999999913 | 0.575 |
| 0.973939999999913 | 0.577 |
| 0.976569999999913 | 0.579 |
| 0.979199999999913 | 0.582 |
| 0.981829999999913 | 0.584 |
| 0.984459999999913 | 0.586 |
| 0.987089999999913 | 0.588 |
| 0.989719999999914 | 0.591 |
| 0.992349999999914 | 0.593 |
| 0.994979999999914 | 0.595 |
| 0.997609999999914 | 0.598 |
| 1.000239999999914 | 0.6 |
| 1.002869999999914 | 0.603 |
| 1.005499999999913 | 0.605 |
| 1.008129999999913 | 0.607 |
| 1.010759999999913 | 0.61 |
| 1.013389999999913 | 0.612 |
| 1.016019999999913 | 0.615 |
| 1.018649999999913 | 0.617 |
| 1.021279999999913 | 0.619 |
| 1.023909999999913 | 0.622 |
| 1.026539999999913 | 0.624 |
| 1.029169999999913 | 0.627 |
| 1.031799999999913 | 0.629 |
| 1.034429999999912 | 0.632 |
| 1.037059999999912 | 0.634 |
| 1.039689999999912 | 0.637 |
| 1.042319999999912 | 0.639 |
| 1.044949999999912 | 0.642 |
| 1.047579999999912 | 0.644 |
| 1.050209999999912 | 0.647 |
| 1.052839999999912 | 0.649 |
| 1.055469999999912 | 0.652 |
| 1.058099999999912 | 0.654 |
| 1.060729999999912 | 0.657 |
| 1.063359999999911 | 0.659 |
| 1.065989999999911 | 0.662 |
| 1.068619999999911 | 0.665 |
| 1.071249999999911 | 0.667 |
| 1.073879999999911 | 0.67 |
| 1.076509999999911 | 0.672 |
| 1.079139999999911 | 0.675 |
| 1.081769999999911 | 0.678 |
| 1.084399999999911 | 0.68 |
| 1.087029999999911 | 0.683 |
| 1.089659999999911 | 0.686 |
| 1.09228999999991 | 0.688 |
| 1.09491999999991 | 0.691 |
| 1.09754999999991 | 0.694 |
| 1.10017999999991 | 0.696 |
| 1.10280999999991 | 0.699 |
| 1.10543999999991 | 0.702 |
| 1.10806999999991 | 0.704 |
| 1.11069999999991 | 0.707 |
| 1.11332999999991 | 0.71 |
| 1.11595999999991 | 0.713 |
| 1.11858999999991 | 0.715 |
| 1.12121999999991 | 0.718 |
| 1.123849999999909 | 0.721 |
| 1.126479999999909 | 0.724 |
| 1.129109999999909 | 0.726 |
| 1.131739999999909 | 0.729 |
| 1.13436999999991 | 0.732 |
| 1.136999999999909 | 0.735 |
| 1.139629999999909 | 0.738 |
| 1.142259999999909 | 0.74 |
| 1.144889999999909 | 0.743 |
| 1.147519999999909 | 0.746 |
| 1.150149999999909 | 0.749 |
| 1.152779999999908 | 0.752 |
| 1.155409999999908 | 0.755 |
| 1.158039999999908 | 0.758 |
| 1.160669999999908 | 0.761 |
| 1.163299999999908 | 0.763 |
| 1.165929999999908 | 0.766 |
| 1.168559999999908 | 0.769 |
| 1.171189999999908 | 0.772 |
| 1.173819999999908 | 0.775 |
| 1.176449999999908 | 0.778 |
| 1.179079999999908 | 0.781 |
| 1.181709999999907 | 0.784 |
| 1.184339999999907 | 0.787 |
| 1.186969999999907 | 0.79 |
| 1.189599999999907 | 0.793 |
| 1.192229999999907 | 0.796 |
| 1.194859999999907 | 0.799 |
| 1.197489999999907 | 0.802 |
| 1.200119999999907 | 0.805 |
| 1.202749999999907 | 0.808 |
| 1.205379999999907 | 0.811 |
| 1.208009999999907 | 0.814 |
| 1.210639999999906 | 0.817 |
| 1.213269999999906 | 0.82 |
| 1.215899999999906 | 0.823 |
| 1.218529999999906 | 0.826 |
| 1.221159999999906 | 0.829 |
| 1.223789999999906 | 0.833 |
| 1.226419999999906 | 0.836 |
| 1.229049999999906 | 0.839 |
| 1.231679999999906 | 0.842 |
| 1.234309999999906 | 0.845 |
| 1.236939999999906 | 0.848 |
| 1.239569999999905 | 0.851 |
| 1.242199999999905 | 0.855 |
| 1.244829999999905 | 0.858 |
| 1.247459999999905 | 0.861 |
| 1.250089999999905 | 0.864 |
| 1.252719999999905 | 0.867 |
| 1.255349999999905 | 0.871 |
| 1.257979999999905 | 0.874 |
| 1.260609999999905 | 0.877 |
| 1.263239999999905 | 0.88 |
| 1.265869999999905 | 0.884 |
| 1.268499999999904 | 0.887 |
| 1.271129999999904 | 0.89 |
| 1.273759999999904 | 0.893 |
| 1.276389999999904 | 0.897 |
| 1.279019999999904 | 0.9 |
| 1.281649999999904 | 0.903 |
| 1.284279999999904 | 0.907 |
| 1.286909999999904 | 0.91 |
| 1.289539999999904 | 0.913 |
| 1.292169999999904 | 0.917 |
| 1.294799999999904 | 0.92 |
| 1.297429999999903 | 0.923 |
| 1.300059999999903 | 0.927 |
| 1.302689999999903 | 0.93 |
| 1.305319999999903 | 0.934 |
| 1.307949999999903 | 0.937 |
| 1.310579999999903 | 0.94 |
| 1.313209999999903 | 0.944 |
| 1.315839999999903 | 0.947 |
| 1.318469999999903 | 0.951 |
| 1.321099999999903 | 0.954 |
| 1.323729999999903 | 0.958 |
| 1.326359999999902 | 0.961 |
| 1.328989999999902 | 0.965 |
| 1.331619999999902 | 0.968 |
| 1.334249999999902 | 0.972 |
| 1.336879999999902 | 0.975 |
| 1.339509999999902 | 0.979 |
| 1.342139999999902 | 0.982 |
| 1.344769999999902 | 0.986 |
| 1.347399999999902 | 0.989 |
| 1.350029999999902 | 0.993 |
| 1.352659999999902 | 0.996 |
| 1.355289999999901 | 1 |
| 1.357919999999901 | 1.004 |
| 1.360549999999901 | 1.007 |
| 1.363179999999901 | 1.011 |
| 1.365809999999901 | 1.014 |
| 1.368439999999901 | 1.018 |
| 1.371069999999901 | 1.022 |
| 1.373699999999901 | 1.025 |
| 1.376329999999901 | 1.029 |
| 1.378959999999901 | 1.033 |
| 1.381589999999901 | 1.036 |
| 1.3842199999999 | 1.04 |
| 1.3868499999999 | 1.044 |
| 1.3894799999999 | 1.047 |
| 1.3921099999999 | 1.051 |
| 1.3947399999999 | 1.055 |
| 1.3973699999999 | 1.059 |
| 1.3999999999999 | 1.062 |